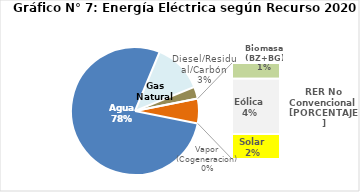
| Category | Series 0 |
|---|---|
| Agua | 2839.647 |
| Gas Natural | 456.11 |
| Diesel/Residual/Carbón | 110.302 |
| Vapor (Cogeneracion) | 0.215 |
| Biomasa (BZ+BG) | 37.348 |
| Eólica | 130.606 |
| Solar | 58.928 |